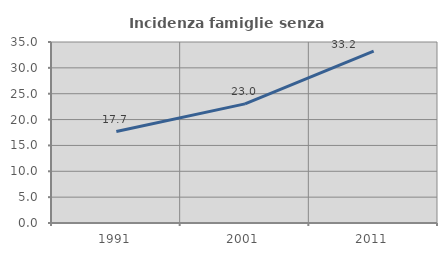
| Category | Incidenza famiglie senza nuclei |
|---|---|
| 1991.0 | 17.689 |
| 2001.0 | 23.031 |
| 2011.0 | 33.219 |